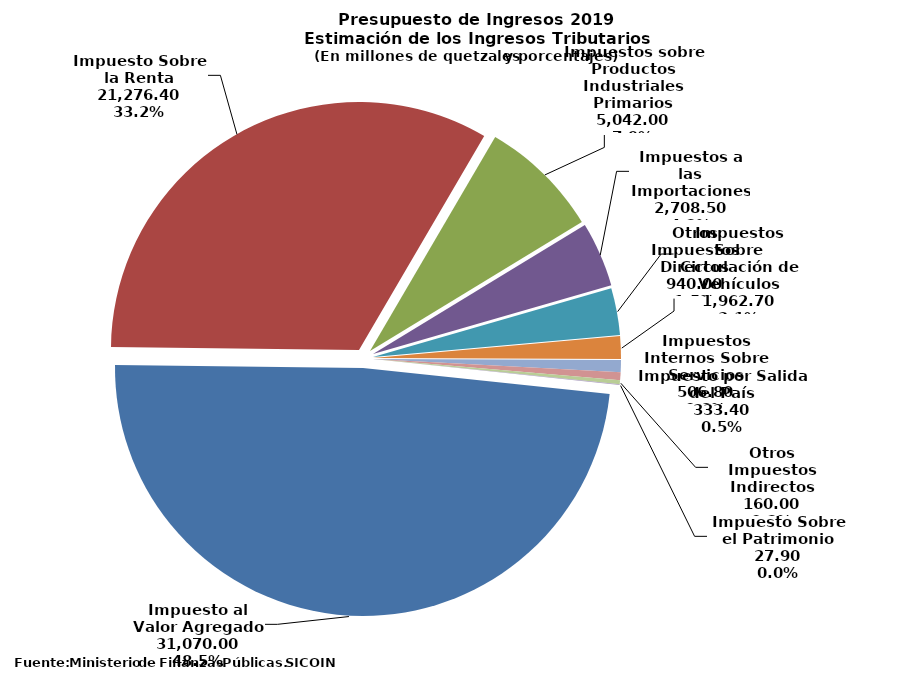
| Category | Aprobado 2017 |
|---|---|
| Impuesto al Valor Agregado | 31070 |
| Impuesto Sobre la Renta | 21276.4 |
| Impuestos sobre Productos Industriales Primarios | 5042 |
| Impuestos a las Importaciones | 2708.5 |
| Impuestos Sobre Circulación de Vehículos | 1962.7 |
| Otros Impuestos Directos | 940 |
| Impuestos Internos Sobre Servicios | 506.8 |
| Impuesto por Salida del País | 333.4 |
| Otros Impuestos Indirectos | 160 |
| Impuesto Sobre el Patrimonio | 27.9 |